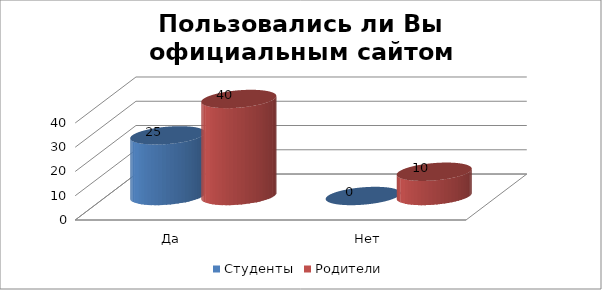
| Category | Студенты | Родители |
|---|---|---|
| Да | 25 | 40 |
| Нет | 0 | 10 |